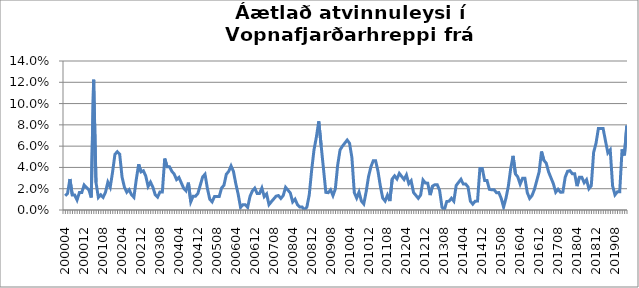
| Category | Series 0 |
|---|---|
| 200004 | 0.013 |
| 200005 | 0.016 |
| 200006 | 0.029 |
| 200007 | 0.014 |
| 200008 | 0.014 |
| 200009 | 0.009 |
| 200010 | 0.016 |
| 200011 | 0.016 |
| 200012 | 0.023 |
| 200101 | 0.021 |
| 200102 | 0.019 |
| 200103 | 0.012 |
| 200104 | 0.122 |
| 200105 | 0.026 |
| 200106 | 0.012 |
| 200107 | 0.014 |
| 200108 | 0.012 |
| 200109 | 0.017 |
| 200110 | 0.026 |
| 200111 | 0.021 |
| 200112 | 0.036 |
| 200201 | 0.052 |
| 200202 | 0.055 |
| 200203 | 0.052 |
| 200204 | 0.031 |
| 200205 | 0.021 |
| 200206 | 0.017 |
| 200207 | 0.019 |
| 200208 | 0.014 |
| 200209 | 0.012 |
| 200210 | 0.029 |
| 200211 | 0.043 |
| 200212 | 0.036 |
| 200301 | 0.037 |
| 200302 | 0.032 |
| 200303 | 0.022 |
| 200304 | 0.026 |
| 200305 | 0.021 |
| 200306 | 0.014 |
| 200307 | 0.012 |
| 200308 | 0.017 |
| 200309 | 0.017 |
| 200310 | 0.048 |
| 200311 | 0.041 |
| 200312 | 0.041 |
| 200401 | 0.036 |
| 200402 | 0.034 |
| 200403 | 0.029 |
| 200404 | 0.031 |
| 200405 | 0.026 |
| 200406 | 0.02 |
| 200407 | 0.018 |
| 200408 | 0.026 |
| 200409 | 0.008 |
| 200410 | 0.013 |
| 200411 | 0.013 |
| 200412 | 0.016 |
| 200501 | 0.023 |
| 200502 | 0.031 |
| 200503 | 0.034 |
| 200504 | 0.02 |
| 200505 | 0.01 |
| 200506 | 0.008 |
| 200507 | 0.013 |
| 200508 | 0.013 |
| 200509 | 0.013 |
| 200510 | 0.021 |
| 200511 | 0.023 |
| 200512 | 0.034 |
| 200601 | 0.036 |
| 200602 | 0.041 |
| 200603 | 0.036 |
| 200604 | 0.025 |
| 200605 | 0.015 |
| 200606 | 0.002 |
| 200607 | 0.005 |
| 200608 | 0.005 |
| 200609 | 0.002 |
| 200610 | 0.013 |
| 200611 | 0.018 |
| 200612 | 0.021 |
| 200701 | 0.016 |
| 200702 | 0.016 |
| 200703 | 0.021 |
| 200704 | 0.013 |
| 200705 | 0.015 |
| 200706 | 0.005 |
| 200707 | 0.008 |
| 200708 | 0.01 |
| 200709 | 0.013 |
| 200710 | 0.014 |
| 200711 | 0.011 |
| 200712 | 0.014 |
| 200801 | 0.021 |
| 200802 | 0.019 |
| 200803 | 0.016 |
| 200804 | 0.008 |
| 200805 | 0.01 |
| 200806 | 0.005 |
| 200807 | 0.003 |
| 200808 | 0.003 |
| 200809 | 0 |
| 200810 | 0.003 |
| 200811 | 0.014 |
| 200812 | 0.037 |
| 200901 | 0.057 |
| 200902 | 0.068 |
| 200903 | 0.083 |
| 200904 | 0.061 |
| 200905 | 0.039 |
| 200906 | 0.017 |
| 200907 | 0.016 |
| 200908 | 0.019 |
| 200909 | 0.014 |
| 200910 | 0.02 |
| 200911 | 0.042 |
| 200912 | 0.056 |
| 201001 | 0.06 |
| 201002 | 0.063 |
| 201003 | 0.066 |
| 201004 | 0.063 |
| 201005 | 0.049 |
| 201006 | 0.016 |
| 201007 | 0.011 |
| 201008 | 0.017 |
| 201009 | 0.008 |
| 201010 | 0.006 |
| 201011 | 0.017 |
| 201012 | 0.031 |
| 201101 | 0.04 |
| 201102 | 0.046 |
| 201103 | 0.046 |
| 201104 | 0.036 |
| 201105 | 0.022 |
| 201106 | 0.011 |
| 201107 | 0.008 |
| 201108 | 0.014 |
| 201109 | 0.008 |
| 201110 | 0.029 |
| 201111 | 0.032 |
| 201112 | 0.029 |
| 201201 | 0.034 |
| 201202 | 0.032 |
| 201203 | 0.029 |
| 201204 | 0.033 |
| 201205 | 0.025 |
| 201206 | 0.027 |
| 201207 | 0.016 |
| 201208 | 0.014 |
| 201209 | 0.011 |
| 201210 | 0.014 |
| 201211 | 0.028 |
| 201212 | 0.025 |
| 201301 | 0.025 |
| 201302 | 0.014 |
| 201303 | 0.022 |
| 201304 | 0.024 |
| 201305 | 0.024 |
| 201306 | 0.018 |
| 201307 | 0.003 |
| 201308 | 0 |
| 201309 | 0.008 |
| 201310 | 0.008 |
| 201311 | 0.011 |
| 201312 | 0.008 |
| 201401 | 0.023 |
| 201402 | 0.026 |
| 201403 | 0.029 |
| 201404 | 0.024 |
| 201405 | 0.024 |
| 201406 | 0.022 |
| 201407 | 0.008 |
| 201408 | 0.005 |
| 201409 | 0.008 |
| 201410 | 0.008 |
| 201411 | 0.039 |
| 201412 | 0.039 |
| 201501 | 0.028 |
| 201502 | 0.028 |
| 201503 | 0.019 |
| 201504 | 0.019 |
| 201505 | 0.019 |
| 201506 | 0.016 |
| 201507 | 0.016 |
| 201508 | 0.011 |
| 201509 | 0.003 |
| 201510 | 0.011 |
| 201511 | 0.022 |
| 201512 | 0.039 |
| 201601 | 0.051 |
| 201602 | 0.034 |
| 201603 | 0.031 |
| 201604 | 0.024 |
| 201605 | 0.03 |
| 201606 | 0.03 |
| 201607 | 0.016 |
| 201608 | 0.011 |
| 201609 | 0.014 |
| 201610 | 0.019 |
| 201611 | 0.028 |
| 201612 | 0.036 |
| 201701 | 0.055 |
| 201702 | 0.047 |
| 201703 | 0.044 |
| 201704 | 0.036 |
| 201705 | 0.03 |
| 201706 | 0.025 |
| 201707 | 0.017 |
| 201708 | 0.019 |
| 201709 | 0.017 |
| 201710 | 0.017 |
| 201711 | 0.031 |
| 201712 | 0.036 |
| 201801 | 0.037 |
| 201802 | 0.034 |
| 201803 | 0.034 |
| 201804 | 0.022 |
| 201805 | 0.031 |
| 201806 | 0.031 |
| 201807 | 0.026 |
| 201808 | 0.028 |
| 201809 | 0.02 |
| 201810 | 0.023 |
| 201811 | 0.054 |
| 201812 | 0.063 |
| 201901 | 0.076 |
| 201902 | 0.076 |
| 201903 | 0.076 |
| 201904 | 0.065 |
| 201905 | 0.054 |
| 201906 | 0.056 |
| 201907 | 0.023 |
| 201908 | 0.014 |
| 201909 | 0.017 |
| 201910 | 0.017 |
| 201911 | 0.057 |
| 201912 | 0.051 |
| 202001 | 0.079 |